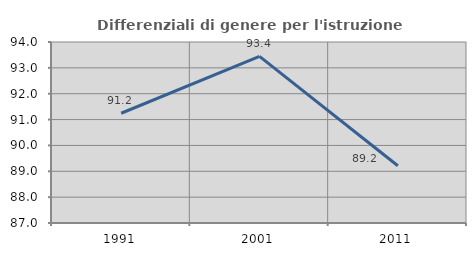
| Category | Differenziali di genere per l'istruzione superiore |
|---|---|
| 1991.0 | 91.244 |
| 2001.0 | 93.442 |
| 2011.0 | 89.215 |